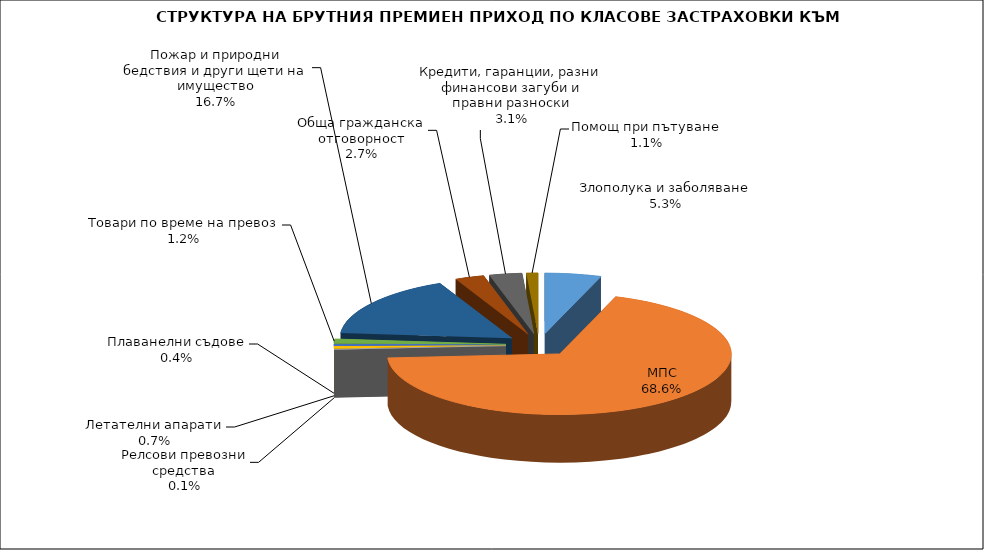
| Category | Злополука и заболяване МПС Релсови превозни средства Летателни апарати Плаванелни съдове Товари по време на превоз Пожар и природни бедствия и други щети на имущество Обща гражданска отговорност Кредити, гаранции, разни финансови загуби и правни разноски  |
|---|---|
| Злополука и заболяване | 0.053 |
| МПС | 0.686 |
| Релсови превозни средства | 0.001 |
| Летателни апарати | 0.007 |
| Плаванелни съдове | 0.004 |
| Товари по време на превоз | 0.012 |
| Пожар и природни бедствия и други щети на имущество | 0.167 |
| Обща гражданска отговорност | 0.027 |
| Кредити, гаранции, разни финансови загуби и правни разноски | 0.031 |
| Помощ при пътуване | 0.011 |